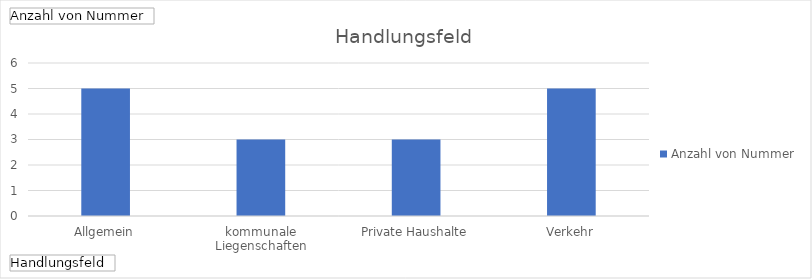
| Category | Ergebnis |
|---|---|
| Allgemein | 5 |
| kommunale Liegenschaften | 3 |
| Private Haushalte | 3 |
| Verkehr | 5 |